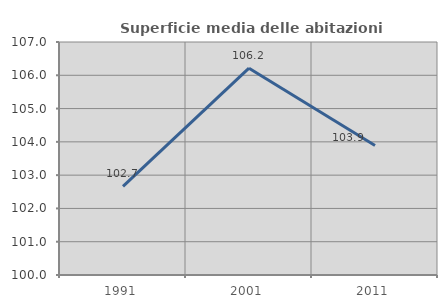
| Category | Superficie media delle abitazioni occupate |
|---|---|
| 1991.0 | 102.663 |
| 2001.0 | 106.214 |
| 2011.0 | 103.891 |